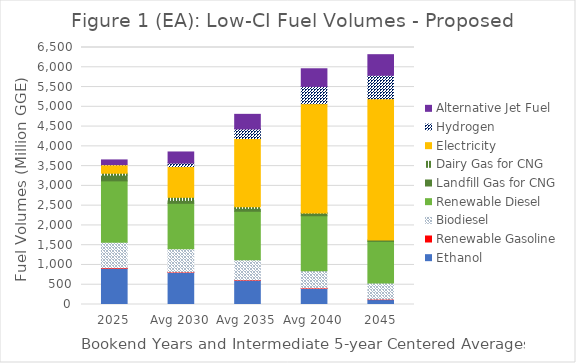
| Category | Ethanol | Renewable Gasoline | Biodiesel | Renewable Diesel | Landfill Gas for CNG | Dairy Gas for CNG | Electricity | Hydrogen | Alternative Jet Fuel |
|---|---|---|---|---|---|---|---|---|---|
| 2025 | 913.355 | 15.177 | 644.244 | 1553.802 | 145.419 | 48.452 | 213.013 | 5.314 | 117.884 |
| Avg 2030 | 809.369 | 11.253 | 586.649 | 1151.999 | 73.799 | 78.374 | 777.105 | 87.448 | 281.901 |
| Avg 2035 | 609.626 | 11.953 | 512.807 | 1223.727 | 73.799 | 42.77 | 1722.918 | 241.867 | 369.876 |
| Avg 2040 | 404.539 | 13.582 | 435.621 | 1390.493 | 67.655 | 5.281 | 2762.485 | 436.496 | 445.844 |
| 2045 | 124.439 | 10.282 | 410.443 | 1052.585 | 32.937 | 0 | 3572.892 | 592.954 | 521.812 |